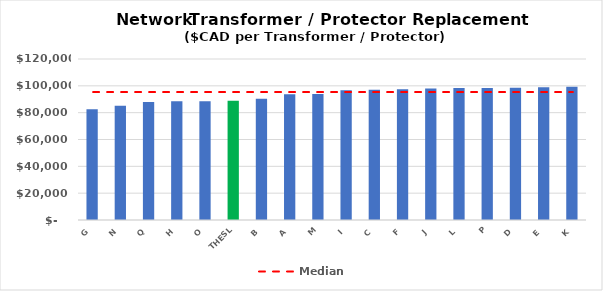
| Category | Series 0 |
|---|---|
| G | 82485.204 |
| N | 85131.645 |
| Q | 87944.823 |
| H | 88554.027 |
| O | 88576.717 |
| THESL | 88943 |
| B | 90447.713 |
| A | 93740.883 |
| M | 93950.77 |
| I | 96787.771 |
| C | 97147.49 |
| F | 97422.169 |
| J | 98090.226 |
| L | 98390.863 |
| P | 98402.561 |
| D | 98648.077 |
| E | 98969.122 |
| K | 99227.159 |